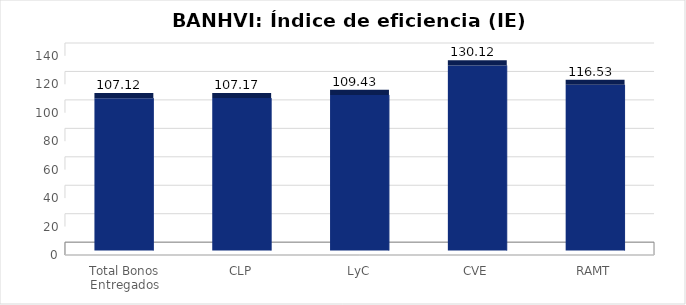
| Category | Índice de eficiencia (IE)  |
|---|---|
| Total Bonos Entregados | 107.118 |
| CLP | 107.172 |
| LyC | 109.428 |
| CVE | 130.12 |
| RAMT | 116.529 |